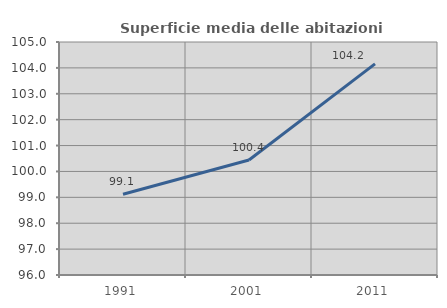
| Category | Superficie media delle abitazioni occupate |
|---|---|
| 1991.0 | 99.121 |
| 2001.0 | 100.444 |
| 2011.0 | 104.157 |